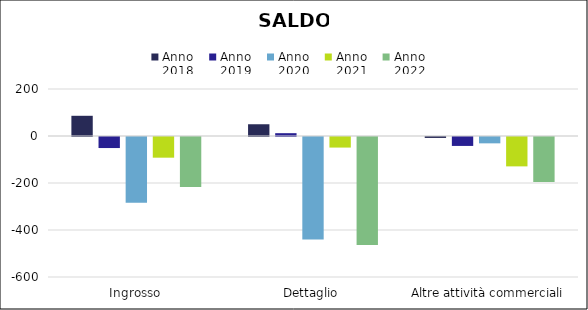
| Category | Anno
2018 | Anno
2019 | Anno
2020 | Anno
2021 | Anno
2022 |
|---|---|---|---|---|---|
| Ingrosso | 86 | -47 | -280 | -88 | -213 |
| Dettaglio | 50 | 12 | -436 | -45 | -460 |
| Altre attività commerciali | -4 | -38 | -27 | -125 | -191 |